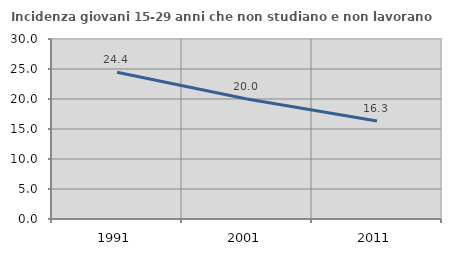
| Category | Incidenza giovani 15-29 anni che non studiano e non lavorano  |
|---|---|
| 1991.0 | 24.444 |
| 2001.0 | 20 |
| 2011.0 | 16.346 |